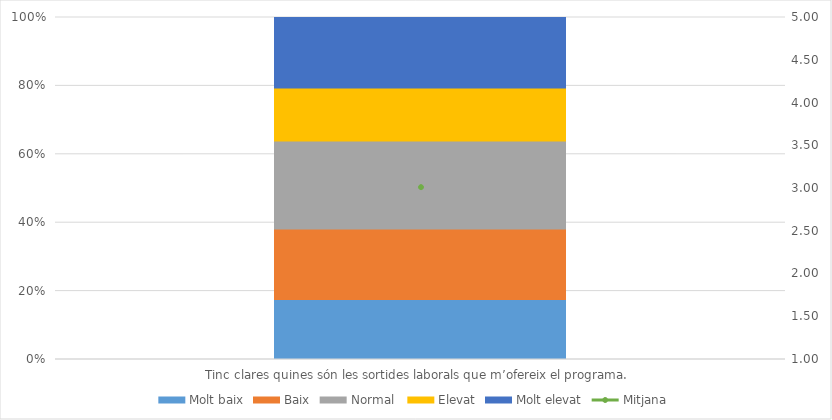
| Category | Molt baix | Baix | Normal  | Elevat | Molt elevat |
|---|---|---|---|---|---|
| Tinc clares quines són les sortides laborals que m’ofereix el programa. | 17 | 20 | 25 | 15 | 20 |